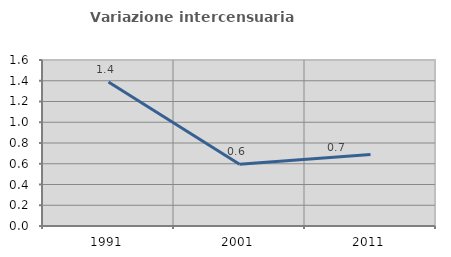
| Category | Variazione intercensuaria annua |
|---|---|
| 1991.0 | 1.388 |
| 2001.0 | 0.595 |
| 2011.0 | 0.69 |